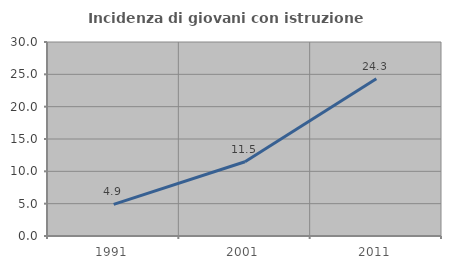
| Category | Incidenza di giovani con istruzione universitaria |
|---|---|
| 1991.0 | 4.899 |
| 2001.0 | 11.482 |
| 2011.0 | 24.319 |